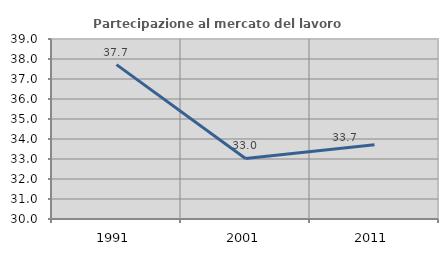
| Category | Partecipazione al mercato del lavoro  femminile |
|---|---|
| 1991.0 | 37.717 |
| 2001.0 | 33.027 |
| 2011.0 | 33.715 |